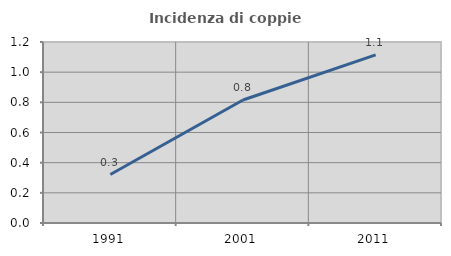
| Category | Incidenza di coppie miste |
|---|---|
| 1991.0 | 0.322 |
| 2001.0 | 0.816 |
| 2011.0 | 1.115 |